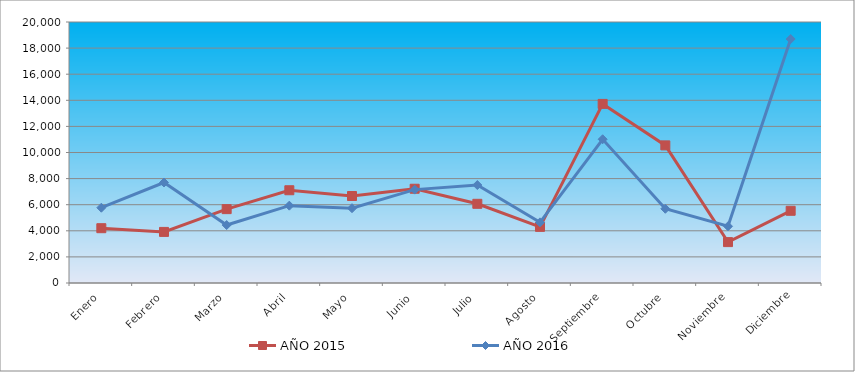
| Category | AÑO 2015 | AÑO 2016 |
|---|---|---|
| Enero | 4199.631 | 5768.907 |
| Febrero | 3915.17 | 7702.309 |
| Marzo | 5660.374 | 4440.622 |
| Abril | 7107.41 | 5926.147 |
| Mayo | 6665.472 | 5730.468 |
| Junio | 7223.123 | 7156.2 |
| Julio | 6068.438 | 7506.259 |
| Agosto | 4300.898 | 4647.307 |
| Septiembre | 13724.079 | 11015.129 |
| Octubre | 10545.504 | 5687.84 |
| Noviembre | 3133.597 | 4347.659 |
| Diciembre | 5533.474 | 18694.787 |